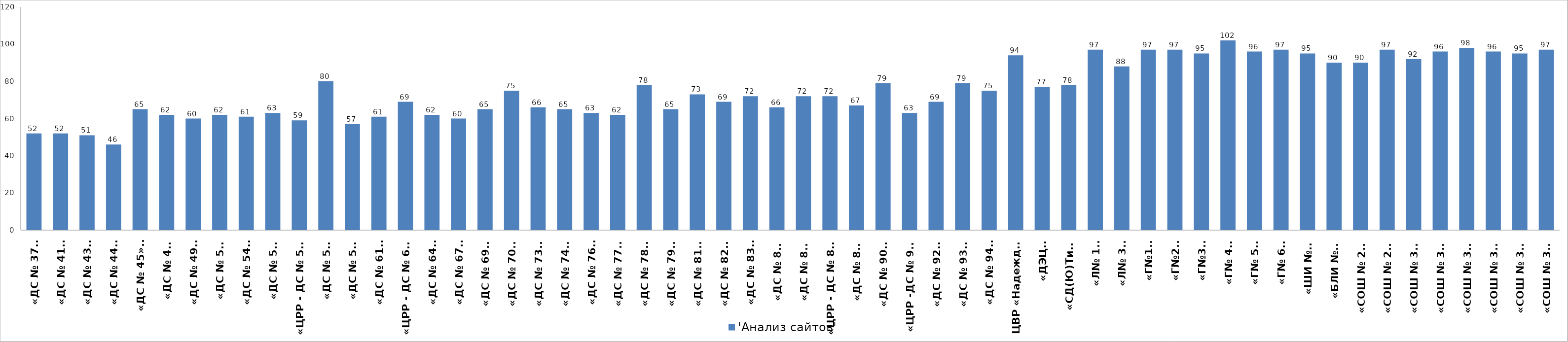
| Category | 'Анализ сайтов' |
|---|---|
| «ДС № 37»  | 52 |
| «ДС № 41»  | 52 |
| «ДС № 43»  | 51 |
| «ДС № 44»  | 46 |
| «ДС № 45»    | 65 |
| «ДС № 47» | 62 |
| «ДС № 49»  | 60 |
| «ДС № 51» | 62 |
| «ДС № 54»  | 61 |
| «ДС № 55» | 63 |
| «ЦРР - ДС № 56»  | 59 |
| «ДС № 58» | 80 |
| «ДС № 59» | 57 |
| «ДС № 61»  | 61 |
| «ЦРР - ДС № 62»  | 69 |
| «ДС № 64»  | 62 |
| «ДС № 67»  | 60 |
| «ДС № 69»   | 65 |
| «ДС № 70»   | 75 |
| «ДС № 73»   | 66 |
| «ДС № 74»   | 65 |
| «ДС № 76»  | 63 |
| «ДС № 77»   | 62 |
| «ДС № 78»   | 78 |
| «ДС № 79»   | 65 |
| «ДС № 81»   | 73 |
| «ДС № 82»   | 69 |
| «ДС № 83»  | 72 |
|   «ДС № 85»  | 66 |
|   «ДС № 86»  | 72 |
|   «ЦРР - ДС № 87»  | 72 |
|   «ДС № 88»  | 67 |
|   «ДС № 90»   | 79 |
|   «ЦРР -ДС № 91»  | 63 |
|   «ДС № 92»   | 69 |
|   «ДС № 93»   | 79 |
|  «ДС № 94»  | 75 |
| ЦВР «Надежда»  | 94 |
|  «ДЭЦ»  | 77 |
| «СД(Ю)ТиЭ»  | 78 |
|  «Л№ 1»  | 97 |
|  «Л№ 3»  | 88 |
|  «Г№1»  | 97 |
|  «Г№2»  | 97 |
|  «Г№3»  | 95 |
|  «Г№ 4»  | 102 |
|  «Г№ 5»  | 96 |
|  «Г№ 6»  | 97 |
|  «ШИ №1»  | 95 |
|  «БЛИ №3»  | 90 |
|  «СОШ № 26»  | 90 |
|  «СОШ № 29»  | 97 |
|  «СОШ № 30»  | 92 |
|  «СОШ № 31»  | 96 |
|  «СОШ № 32»  | 98 |
|  «СОШ № 33»  | 96 |
|  «СОШ № 34»  | 95 |
|  «СОШ № 35»  | 97 |